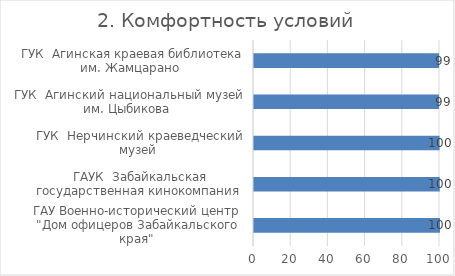
| Category | 2. Комфортность условий |
|---|---|
| ГАУ Военно-исторический центр  "Дом офицеров Забайкальского края"  | 100 |
| ГАУК  Забайкальская государственная кинокомпания  | 99.866 |
| ГУК  Нерчинский краеведческий музей  | 99.762 |
| ГУК  Агинский национальный музей им. Цыбикова  | 99.45 |
| ГУК  Агинская краевая библиотека им. Жамцарано  | 99.496 |